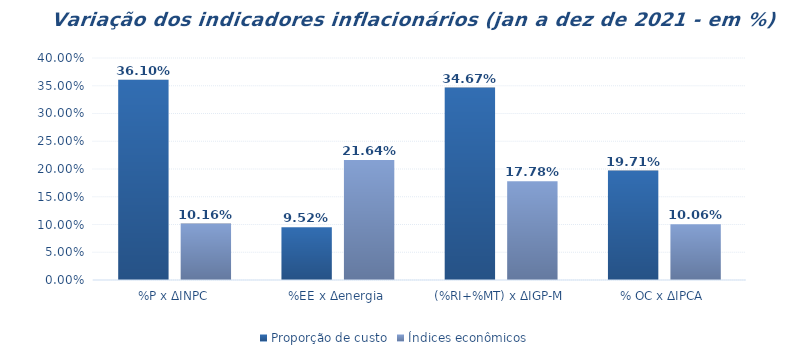
| Category | Proporção de custo | Índices econômicos |
|---|---|---|
| %P x ΔINPC | 0.361 | 0.102 |
| %EE x Δenergia | 0.095 | 0.216 |
| (%RI+%MT) x ΔIGP-M | 0.347 | 0.178 |
| % OC x ΔIPCA | 0.197 | 0.101 |